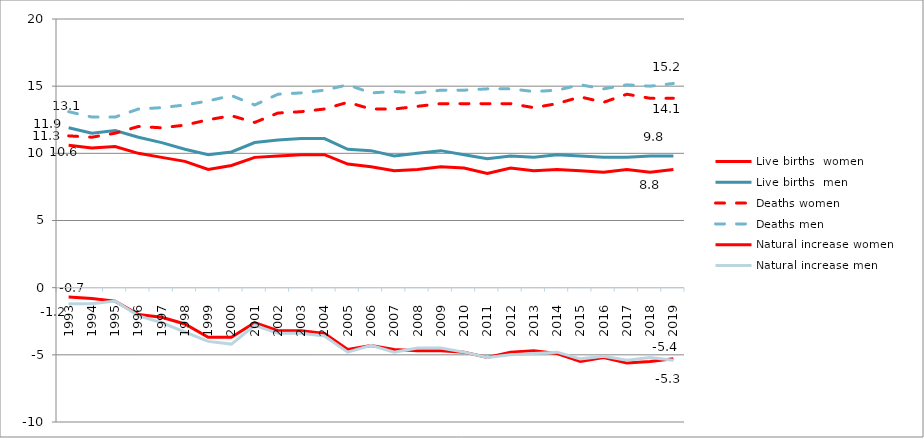
| Category | Live births  | Deaths | Natural increase |
|---|---|---|---|
| 1993.0 | 11.9 | 13.1 | -1.2 |
| 1994.0 | 11.5 | 12.7 | -1.2 |
| 1995.0 | 11.7 | 12.7 | -1 |
| 1996.0 | 11.2 | 13.3 | -2.1 |
| 1997.0 | 10.8 | 13.4 | -2.6 |
| 1998.0 | 10.3 | 13.6 | -3.3 |
| 1999.0 | 9.9 | 13.9 | -4 |
| 2000.0 | 10.1 | 14.3 | -4.2 |
| 2001.0 | 10.8 | 13.6 | -2.8 |
| 2002.0 | 11 | 14.4 | -3.4 |
| 2003.0 | 11.1 | 14.5 | -3.4 |
| 2004.0 | 11.1 | 14.7 | -3.6 |
| 2005.0 | 10.3 | 15.1 | -4.8 |
| 2006.0 | 10.2 | 14.5 | -4.3 |
| 2007.0 | 9.8 | 14.6 | -4.8 |
| 2008.0 | 10 | 14.5 | -4.5 |
| 2009.0 | 10.2 | 14.7 | -4.5 |
| 2010.0 | 9.9 | 14.7 | -4.8 |
| 2011.0 | 9.6 | 14.8 | -5.2 |
| 2012.0 | 9.8 | 14.8 | -5 |
| 2013.0 | 9.7 | 14.6 | -4.9 |
| 2014.0 | 9.9 | 14.7 | -4.8 |
| 2015.0 | 9.8 | 15.1 | -5.3 |
| 2016.0 | 9.7 | 14.8 | -5.1 |
| 2017.0 | 9.7 | 15.1 | -5.4 |
| 2018.0 | 9.8 | 15 | -5.2 |
| 2019.0 | 9.8 | 15.2 | -5.4 |